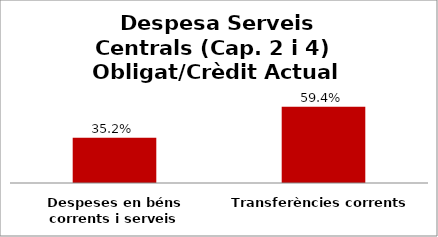
| Category | Series 0 |
|---|---|
| Despeses en béns corrents i serveis | 0.352 |
| Transferències corrents | 0.594 |